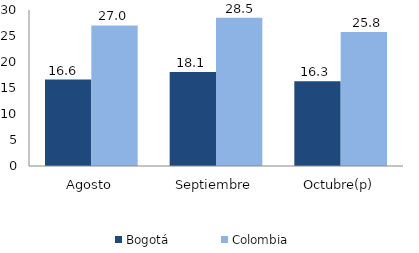
| Category | Bogotá | Colombia |
|---|---|---|
| Agosto | 16.612 | 27.036 |
| Septiembre | 18.065 | 28.527 |
| Octubre(p) | 16.319 | 25.768 |